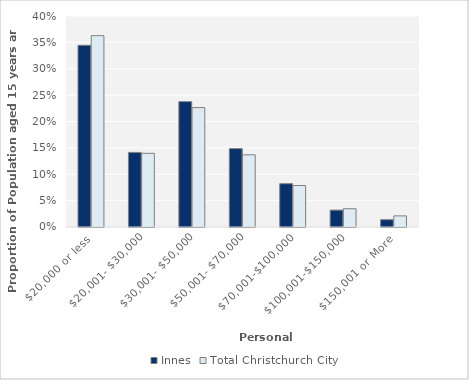
| Category | Innes | Total Christchurch City |
|---|---|---|
| $20,000 or less | 0.344 | 0.363 |
| $20,001- $30,000 | 0.141 | 0.14 |
| $30,001- $50,000 | 0.238 | 0.226 |
| $50,001- $70,000 | 0.149 | 0.137 |
| $70,001-$100,000 | 0.082 | 0.079 |
| $100,001-$150,000 | 0.032 | 0.035 |
| $150,001 or More | 0.014 | 0.021 |